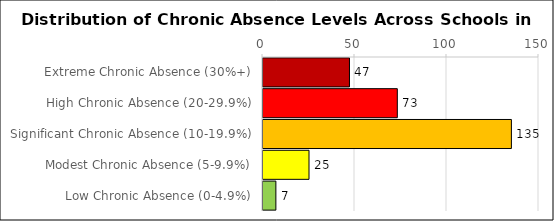
| Category | Number of Schools |
|---|---|
| Extreme Chronic Absence (30%+) | 47 |
| High Chronic Absence (20-29.9%) | 73 |
| Significant Chronic Absence (10-19.9%) | 135 |
| Modest Chronic Absence (5-9.9%) | 25 |
| Low Chronic Absence (0-4.9%) | 7 |